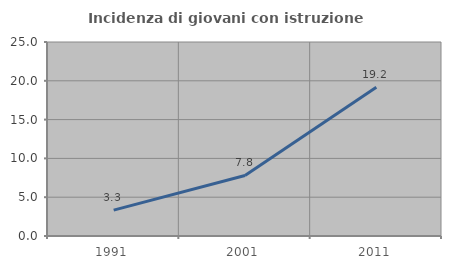
| Category | Incidenza di giovani con istruzione universitaria |
|---|---|
| 1991.0 | 3.333 |
| 2001.0 | 7.798 |
| 2011.0 | 19.162 |